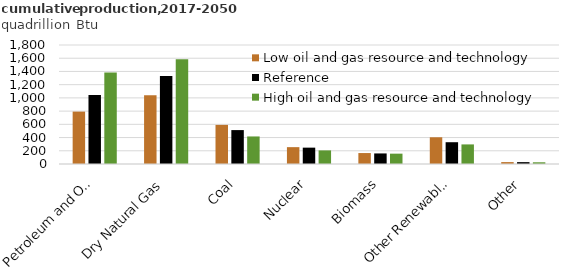
| Category | Low oil and gas resource and technology | Reference | High oil and gas resource and technology |
|---|---|---|---|
| Petroleum and Other Liquids | 792.533 | 1045.329 | 1384.472 |
| Dry Natural Gas | 1040.297 | 1330.774 | 1582.995 |
| Coal | 591.593 | 512.913 | 416.72 |
| Nuclear | 254.936 | 247.361 | 205.781 |
| Biomass | 165.656 | 159.807 | 156.44 |
| Other Renewables | 404.289 | 329.502 | 296.311 |
| Other | 28.88 | 28.206 | 25.827 |